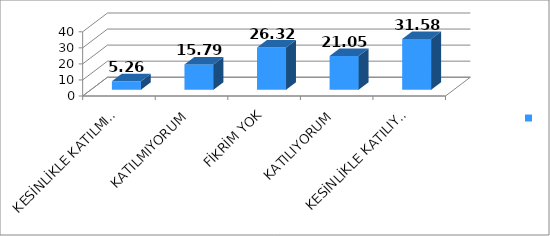
| Category | Series 0 |
|---|---|
| KESİNLİKLE KATILMIYORUM | 5.26 |
| KATILMIYORUM | 15.79 |
| FİKRİM YOK | 26.32 |
| KATILIYORUM | 21.05 |
| KESİNLİKLE KATILIYORUM | 31.58 |